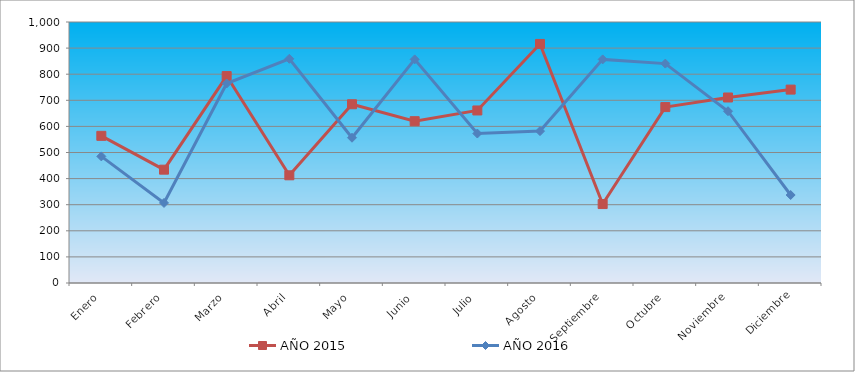
| Category | AÑO 2015 | AÑO 2016 |
|---|---|---|
| Enero | 563.845 | 485.147 |
| Febrero | 434.225 | 306.752 |
| Marzo | 792.839 | 764.384 |
| Abril | 412.622 | 859.066 |
| Mayo | 684.823 | 556.545 |
| Junio | 620.013 | 856.757 |
| Julio | 661.059 | 572.711 |
| Agosto | 915.978 | 581.948 |
| Septiembre | 302.445 | 856.757 |
| Octubre | 674.021 | 840.591 |
| Noviembre | 710.747 | 658.155 |
| Diciembre | 740.991 | 337.16 |